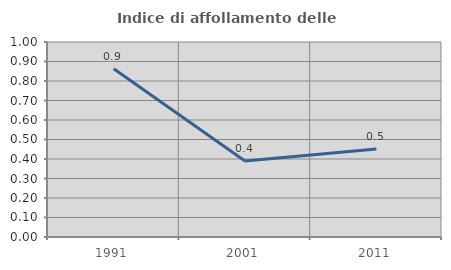
| Category | Indice di affollamento delle abitazioni  |
|---|---|
| 1991.0 | 0.863 |
| 2001.0 | 0.39 |
| 2011.0 | 0.451 |